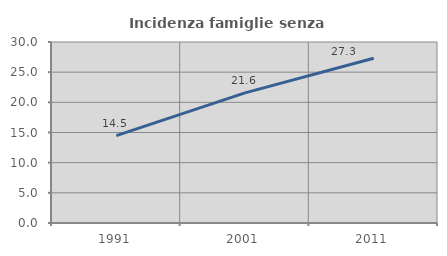
| Category | Incidenza famiglie senza nuclei |
|---|---|
| 1991.0 | 14.492 |
| 2001.0 | 21.575 |
| 2011.0 | 27.302 |